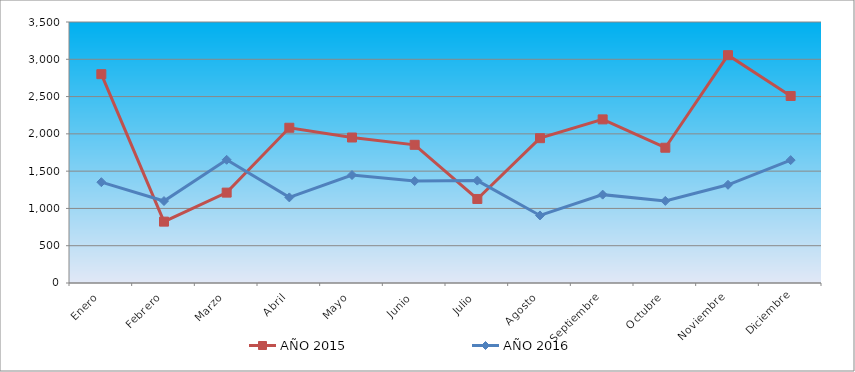
| Category | AÑO 2015 | AÑO 2016 |
|---|---|---|
| Enero | 2800 | 1352 |
| Febrero | 823 | 1099 |
| Marzo | 1212 | 1652 |
| Abril | 2082 | 1148 |
| Mayo | 1951 | 1448 |
| Junio | 1853 | 1368 |
| Julio | 1127 | 1373 |
| Agosto | 1942 | 906 |
| Septiembre | 2194 | 1185 |
| Octubre | 1814 | 1101 |
| Noviembre | 3055 | 1317 |
| Diciembre | 2508 | 1648 |